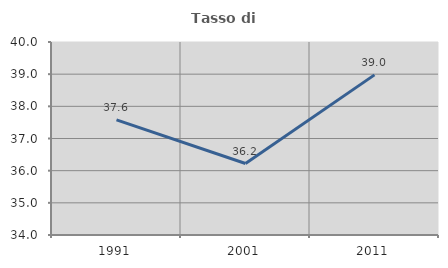
| Category | Tasso di occupazione   |
|---|---|
| 1991.0 | 37.58 |
| 2001.0 | 36.222 |
| 2011.0 | 38.978 |